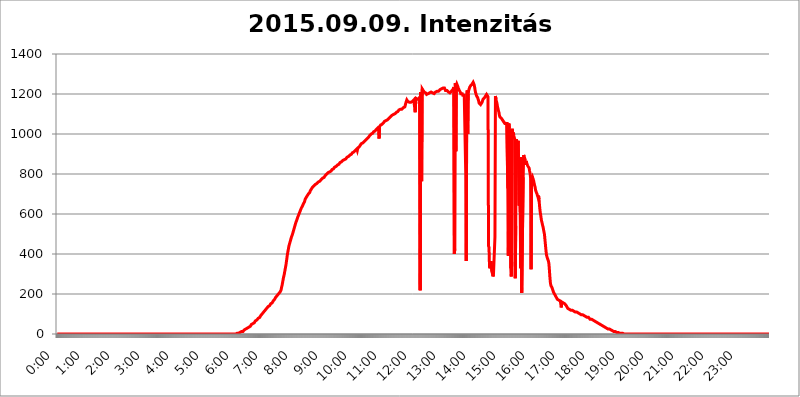
| Category | 2015.09.09. Intenzitás [W/m^2] |
|---|---|
| 0.0 | 0 |
| 0.0006944444444444445 | 0 |
| 0.001388888888888889 | 0 |
| 0.0020833333333333333 | 0 |
| 0.002777777777777778 | 0 |
| 0.003472222222222222 | 0 |
| 0.004166666666666667 | 0 |
| 0.004861111111111111 | 0 |
| 0.005555555555555556 | 0 |
| 0.0062499999999999995 | 0 |
| 0.006944444444444444 | 0 |
| 0.007638888888888889 | 0 |
| 0.008333333333333333 | 0 |
| 0.009027777777777779 | 0 |
| 0.009722222222222222 | 0 |
| 0.010416666666666666 | 0 |
| 0.011111111111111112 | 0 |
| 0.011805555555555555 | 0 |
| 0.012499999999999999 | 0 |
| 0.013194444444444444 | 0 |
| 0.013888888888888888 | 0 |
| 0.014583333333333332 | 0 |
| 0.015277777777777777 | 0 |
| 0.015972222222222224 | 0 |
| 0.016666666666666666 | 0 |
| 0.017361111111111112 | 0 |
| 0.018055555555555557 | 0 |
| 0.01875 | 0 |
| 0.019444444444444445 | 0 |
| 0.02013888888888889 | 0 |
| 0.020833333333333332 | 0 |
| 0.02152777777777778 | 0 |
| 0.022222222222222223 | 0 |
| 0.02291666666666667 | 0 |
| 0.02361111111111111 | 0 |
| 0.024305555555555556 | 0 |
| 0.024999999999999998 | 0 |
| 0.025694444444444447 | 0 |
| 0.02638888888888889 | 0 |
| 0.027083333333333334 | 0 |
| 0.027777777777777776 | 0 |
| 0.02847222222222222 | 0 |
| 0.029166666666666664 | 0 |
| 0.029861111111111113 | 0 |
| 0.030555555555555555 | 0 |
| 0.03125 | 0 |
| 0.03194444444444445 | 0 |
| 0.03263888888888889 | 0 |
| 0.03333333333333333 | 0 |
| 0.034027777777777775 | 0 |
| 0.034722222222222224 | 0 |
| 0.035416666666666666 | 0 |
| 0.036111111111111115 | 0 |
| 0.03680555555555556 | 0 |
| 0.0375 | 0 |
| 0.03819444444444444 | 0 |
| 0.03888888888888889 | 0 |
| 0.03958333333333333 | 0 |
| 0.04027777777777778 | 0 |
| 0.04097222222222222 | 0 |
| 0.041666666666666664 | 0 |
| 0.042361111111111106 | 0 |
| 0.04305555555555556 | 0 |
| 0.043750000000000004 | 0 |
| 0.044444444444444446 | 0 |
| 0.04513888888888889 | 0 |
| 0.04583333333333334 | 0 |
| 0.04652777777777778 | 0 |
| 0.04722222222222222 | 0 |
| 0.04791666666666666 | 0 |
| 0.04861111111111111 | 0 |
| 0.049305555555555554 | 0 |
| 0.049999999999999996 | 0 |
| 0.05069444444444445 | 0 |
| 0.051388888888888894 | 0 |
| 0.052083333333333336 | 0 |
| 0.05277777777777778 | 0 |
| 0.05347222222222222 | 0 |
| 0.05416666666666667 | 0 |
| 0.05486111111111111 | 0 |
| 0.05555555555555555 | 0 |
| 0.05625 | 0 |
| 0.05694444444444444 | 0 |
| 0.057638888888888885 | 0 |
| 0.05833333333333333 | 0 |
| 0.05902777777777778 | 0 |
| 0.059722222222222225 | 0 |
| 0.06041666666666667 | 0 |
| 0.061111111111111116 | 0 |
| 0.06180555555555556 | 0 |
| 0.0625 | 0 |
| 0.06319444444444444 | 0 |
| 0.06388888888888888 | 0 |
| 0.06458333333333334 | 0 |
| 0.06527777777777778 | 0 |
| 0.06597222222222222 | 0 |
| 0.06666666666666667 | 0 |
| 0.06736111111111111 | 0 |
| 0.06805555555555555 | 0 |
| 0.06874999999999999 | 0 |
| 0.06944444444444443 | 0 |
| 0.07013888888888889 | 0 |
| 0.07083333333333333 | 0 |
| 0.07152777777777779 | 0 |
| 0.07222222222222223 | 0 |
| 0.07291666666666667 | 0 |
| 0.07361111111111111 | 0 |
| 0.07430555555555556 | 0 |
| 0.075 | 0 |
| 0.07569444444444444 | 0 |
| 0.0763888888888889 | 0 |
| 0.07708333333333334 | 0 |
| 0.07777777777777778 | 0 |
| 0.07847222222222222 | 0 |
| 0.07916666666666666 | 0 |
| 0.0798611111111111 | 0 |
| 0.08055555555555556 | 0 |
| 0.08125 | 0 |
| 0.08194444444444444 | 0 |
| 0.08263888888888889 | 0 |
| 0.08333333333333333 | 0 |
| 0.08402777777777777 | 0 |
| 0.08472222222222221 | 0 |
| 0.08541666666666665 | 0 |
| 0.08611111111111112 | 0 |
| 0.08680555555555557 | 0 |
| 0.08750000000000001 | 0 |
| 0.08819444444444445 | 0 |
| 0.08888888888888889 | 0 |
| 0.08958333333333333 | 0 |
| 0.09027777777777778 | 0 |
| 0.09097222222222222 | 0 |
| 0.09166666666666667 | 0 |
| 0.09236111111111112 | 0 |
| 0.09305555555555556 | 0 |
| 0.09375 | 0 |
| 0.09444444444444444 | 0 |
| 0.09513888888888888 | 0 |
| 0.09583333333333333 | 0 |
| 0.09652777777777777 | 0 |
| 0.09722222222222222 | 0 |
| 0.09791666666666667 | 0 |
| 0.09861111111111111 | 0 |
| 0.09930555555555555 | 0 |
| 0.09999999999999999 | 0 |
| 0.10069444444444443 | 0 |
| 0.1013888888888889 | 0 |
| 0.10208333333333335 | 0 |
| 0.10277777777777779 | 0 |
| 0.10347222222222223 | 0 |
| 0.10416666666666667 | 0 |
| 0.10486111111111111 | 0 |
| 0.10555555555555556 | 0 |
| 0.10625 | 0 |
| 0.10694444444444444 | 0 |
| 0.1076388888888889 | 0 |
| 0.10833333333333334 | 0 |
| 0.10902777777777778 | 0 |
| 0.10972222222222222 | 0 |
| 0.1111111111111111 | 0 |
| 0.11180555555555556 | 0 |
| 0.11180555555555556 | 0 |
| 0.1125 | 0 |
| 0.11319444444444444 | 0 |
| 0.11388888888888889 | 0 |
| 0.11458333333333333 | 0 |
| 0.11527777777777777 | 0 |
| 0.11597222222222221 | 0 |
| 0.11666666666666665 | 0 |
| 0.1173611111111111 | 0 |
| 0.11805555555555557 | 0 |
| 0.11944444444444445 | 0 |
| 0.12013888888888889 | 0 |
| 0.12083333333333333 | 0 |
| 0.12152777777777778 | 0 |
| 0.12222222222222223 | 0 |
| 0.12291666666666667 | 0 |
| 0.12291666666666667 | 0 |
| 0.12361111111111112 | 0 |
| 0.12430555555555556 | 0 |
| 0.125 | 0 |
| 0.12569444444444444 | 0 |
| 0.12638888888888888 | 0 |
| 0.12708333333333333 | 0 |
| 0.16875 | 0 |
| 0.12847222222222224 | 0 |
| 0.12916666666666668 | 0 |
| 0.12986111111111112 | 0 |
| 0.13055555555555556 | 0 |
| 0.13125 | 0 |
| 0.13194444444444445 | 0 |
| 0.1326388888888889 | 0 |
| 0.13333333333333333 | 0 |
| 0.13402777777777777 | 0 |
| 0.13402777777777777 | 0 |
| 0.13472222222222222 | 0 |
| 0.13541666666666666 | 0 |
| 0.1361111111111111 | 0 |
| 0.13749999999999998 | 0 |
| 0.13819444444444443 | 0 |
| 0.1388888888888889 | 0 |
| 0.13958333333333334 | 0 |
| 0.14027777777777778 | 0 |
| 0.14097222222222222 | 0 |
| 0.14166666666666666 | 0 |
| 0.1423611111111111 | 0 |
| 0.14305555555555557 | 0 |
| 0.14375000000000002 | 0 |
| 0.14444444444444446 | 0 |
| 0.1451388888888889 | 0 |
| 0.1451388888888889 | 0 |
| 0.14652777777777778 | 0 |
| 0.14722222222222223 | 0 |
| 0.14791666666666667 | 0 |
| 0.1486111111111111 | 0 |
| 0.14930555555555555 | 0 |
| 0.15 | 0 |
| 0.15069444444444444 | 0 |
| 0.15138888888888888 | 0 |
| 0.15208333333333332 | 0 |
| 0.15277777777777776 | 0 |
| 0.15347222222222223 | 0 |
| 0.15416666666666667 | 0 |
| 0.15486111111111112 | 0 |
| 0.15555555555555556 | 0 |
| 0.15625 | 0 |
| 0.15694444444444444 | 0 |
| 0.15763888888888888 | 0 |
| 0.15833333333333333 | 0 |
| 0.15902777777777777 | 0 |
| 0.15972222222222224 | 0 |
| 0.16041666666666668 | 0 |
| 0.16111111111111112 | 0 |
| 0.16180555555555556 | 0 |
| 0.1625 | 0 |
| 0.16319444444444445 | 0 |
| 0.1638888888888889 | 0 |
| 0.16458333333333333 | 0 |
| 0.16527777777777777 | 0 |
| 0.16597222222222222 | 0 |
| 0.16666666666666666 | 0 |
| 0.1673611111111111 | 0 |
| 0.16805555555555554 | 0 |
| 0.16874999999999998 | 0 |
| 0.16944444444444443 | 0 |
| 0.17013888888888887 | 0 |
| 0.1708333333333333 | 0 |
| 0.17152777777777775 | 0 |
| 0.17222222222222225 | 0 |
| 0.1729166666666667 | 0 |
| 0.17361111111111113 | 0 |
| 0.17430555555555557 | 0 |
| 0.17500000000000002 | 0 |
| 0.17569444444444446 | 0 |
| 0.1763888888888889 | 0 |
| 0.17708333333333334 | 0 |
| 0.17777777777777778 | 0 |
| 0.17847222222222223 | 0 |
| 0.17916666666666667 | 0 |
| 0.1798611111111111 | 0 |
| 0.18055555555555555 | 0 |
| 0.18125 | 0 |
| 0.18194444444444444 | 0 |
| 0.1826388888888889 | 0 |
| 0.18333333333333335 | 0 |
| 0.1840277777777778 | 0 |
| 0.18472222222222223 | 0 |
| 0.18541666666666667 | 0 |
| 0.18611111111111112 | 0 |
| 0.18680555555555556 | 0 |
| 0.1875 | 0 |
| 0.18819444444444444 | 0 |
| 0.18888888888888888 | 0 |
| 0.18958333333333333 | 0 |
| 0.19027777777777777 | 0 |
| 0.1909722222222222 | 0 |
| 0.19166666666666665 | 0 |
| 0.19236111111111112 | 0 |
| 0.19305555555555554 | 0 |
| 0.19375 | 0 |
| 0.19444444444444445 | 0 |
| 0.1951388888888889 | 0 |
| 0.19583333333333333 | 0 |
| 0.19652777777777777 | 0 |
| 0.19722222222222222 | 0 |
| 0.19791666666666666 | 0 |
| 0.1986111111111111 | 0 |
| 0.19930555555555554 | 0 |
| 0.19999999999999998 | 0 |
| 0.20069444444444443 | 0 |
| 0.20138888888888887 | 0 |
| 0.2020833333333333 | 0 |
| 0.2027777777777778 | 0 |
| 0.2034722222222222 | 0 |
| 0.2041666666666667 | 0 |
| 0.20486111111111113 | 0 |
| 0.20555555555555557 | 0 |
| 0.20625000000000002 | 0 |
| 0.20694444444444446 | 0 |
| 0.2076388888888889 | 0 |
| 0.20833333333333334 | 0 |
| 0.20902777777777778 | 0 |
| 0.20972222222222223 | 0 |
| 0.21041666666666667 | 0 |
| 0.2111111111111111 | 0 |
| 0.21180555555555555 | 0 |
| 0.2125 | 0 |
| 0.21319444444444444 | 0 |
| 0.2138888888888889 | 0 |
| 0.21458333333333335 | 0 |
| 0.2152777777777778 | 0 |
| 0.21597222222222223 | 0 |
| 0.21666666666666667 | 0 |
| 0.21736111111111112 | 0 |
| 0.21805555555555556 | 0 |
| 0.21875 | 0 |
| 0.21944444444444444 | 0 |
| 0.22013888888888888 | 0 |
| 0.22083333333333333 | 0 |
| 0.22152777777777777 | 0 |
| 0.2222222222222222 | 0 |
| 0.22291666666666665 | 0 |
| 0.2236111111111111 | 0 |
| 0.22430555555555556 | 0 |
| 0.225 | 0 |
| 0.22569444444444445 | 0 |
| 0.2263888888888889 | 0 |
| 0.22708333333333333 | 0 |
| 0.22777777777777777 | 0 |
| 0.22847222222222222 | 0 |
| 0.22916666666666666 | 0 |
| 0.2298611111111111 | 0 |
| 0.23055555555555554 | 0 |
| 0.23124999999999998 | 0 |
| 0.23194444444444443 | 0 |
| 0.23263888888888887 | 0 |
| 0.2333333333333333 | 0 |
| 0.2340277777777778 | 0 |
| 0.2347222222222222 | 0 |
| 0.2354166666666667 | 0 |
| 0.23611111111111113 | 0 |
| 0.23680555555555557 | 0 |
| 0.23750000000000002 | 0 |
| 0.23819444444444446 | 0 |
| 0.2388888888888889 | 0 |
| 0.23958333333333334 | 0 |
| 0.24027777777777778 | 0 |
| 0.24097222222222223 | 0 |
| 0.24166666666666667 | 0 |
| 0.2423611111111111 | 0 |
| 0.24305555555555555 | 0 |
| 0.24375 | 0 |
| 0.24444444444444446 | 0 |
| 0.24513888888888888 | 0 |
| 0.24583333333333335 | 0 |
| 0.2465277777777778 | 0 |
| 0.24722222222222223 | 0 |
| 0.24791666666666667 | 0 |
| 0.24861111111111112 | 0 |
| 0.24930555555555556 | 0 |
| 0.25 | 0 |
| 0.25069444444444444 | 3.525 |
| 0.2513888888888889 | 3.525 |
| 0.2520833333333333 | 3.525 |
| 0.25277777777777777 | 3.525 |
| 0.2534722222222222 | 3.525 |
| 0.25416666666666665 | 3.525 |
| 0.2548611111111111 | 7.887 |
| 0.2555555555555556 | 7.887 |
| 0.25625000000000003 | 7.887 |
| 0.2569444444444445 | 7.887 |
| 0.2576388888888889 | 12.257 |
| 0.25833333333333336 | 12.257 |
| 0.2590277777777778 | 12.257 |
| 0.25972222222222224 | 12.257 |
| 0.2604166666666667 | 12.257 |
| 0.2611111111111111 | 16.636 |
| 0.26180555555555557 | 16.636 |
| 0.2625 | 21.024 |
| 0.26319444444444445 | 21.024 |
| 0.2638888888888889 | 21.024 |
| 0.26458333333333334 | 25.419 |
| 0.2652777777777778 | 25.419 |
| 0.2659722222222222 | 29.823 |
| 0.26666666666666666 | 29.823 |
| 0.2673611111111111 | 29.823 |
| 0.26805555555555555 | 34.234 |
| 0.26875 | 34.234 |
| 0.26944444444444443 | 38.653 |
| 0.2701388888888889 | 38.653 |
| 0.2708333333333333 | 38.653 |
| 0.27152777777777776 | 43.079 |
| 0.2722222222222222 | 47.511 |
| 0.27291666666666664 | 47.511 |
| 0.2736111111111111 | 47.511 |
| 0.2743055555555555 | 51.951 |
| 0.27499999999999997 | 51.951 |
| 0.27569444444444446 | 56.398 |
| 0.27638888888888885 | 56.398 |
| 0.27708333333333335 | 60.85 |
| 0.2777777777777778 | 65.31 |
| 0.27847222222222223 | 65.31 |
| 0.2791666666666667 | 69.775 |
| 0.2798611111111111 | 69.775 |
| 0.28055555555555556 | 69.775 |
| 0.28125 | 74.246 |
| 0.28194444444444444 | 78.722 |
| 0.2826388888888889 | 78.722 |
| 0.2833333333333333 | 83.205 |
| 0.28402777777777777 | 83.205 |
| 0.2847222222222222 | 87.692 |
| 0.28541666666666665 | 92.184 |
| 0.28611111111111115 | 92.184 |
| 0.28680555555555554 | 96.682 |
| 0.28750000000000003 | 101.184 |
| 0.2881944444444445 | 101.184 |
| 0.2888888888888889 | 105.69 |
| 0.28958333333333336 | 110.201 |
| 0.2902777777777778 | 110.201 |
| 0.29097222222222224 | 114.716 |
| 0.2916666666666667 | 119.235 |
| 0.2923611111111111 | 119.235 |
| 0.29305555555555557 | 123.758 |
| 0.29375 | 128.284 |
| 0.29444444444444445 | 132.814 |
| 0.2951388888888889 | 132.814 |
| 0.29583333333333334 | 137.347 |
| 0.2965277777777778 | 137.347 |
| 0.2972222222222222 | 141.884 |
| 0.29791666666666666 | 141.884 |
| 0.2986111111111111 | 146.423 |
| 0.29930555555555555 | 150.964 |
| 0.3 | 150.964 |
| 0.30069444444444443 | 155.509 |
| 0.3013888888888889 | 155.509 |
| 0.3020833333333333 | 160.056 |
| 0.30277777777777776 | 164.605 |
| 0.3034722222222222 | 169.156 |
| 0.30416666666666664 | 169.156 |
| 0.3048611111111111 | 173.709 |
| 0.3055555555555555 | 178.264 |
| 0.30624999999999997 | 182.82 |
| 0.3069444444444444 | 182.82 |
| 0.3076388888888889 | 187.378 |
| 0.30833333333333335 | 191.937 |
| 0.3090277777777778 | 191.937 |
| 0.30972222222222223 | 196.497 |
| 0.3104166666666667 | 201.058 |
| 0.3111111111111111 | 201.058 |
| 0.31180555555555556 | 205.62 |
| 0.3125 | 210.182 |
| 0.31319444444444444 | 214.746 |
| 0.3138888888888889 | 219.309 |
| 0.3145833333333333 | 233 |
| 0.31527777777777777 | 242.127 |
| 0.3159722222222222 | 255.813 |
| 0.31666666666666665 | 269.49 |
| 0.31736111111111115 | 283.156 |
| 0.31805555555555554 | 292.259 |
| 0.31875000000000003 | 305.898 |
| 0.3194444444444445 | 319.517 |
| 0.3201388888888889 | 333.113 |
| 0.32083333333333336 | 346.682 |
| 0.3215277777777778 | 364.728 |
| 0.32222222222222224 | 382.715 |
| 0.3229166666666667 | 400.638 |
| 0.3236111111111111 | 414.035 |
| 0.32430555555555557 | 427.39 |
| 0.325 | 440.702 |
| 0.32569444444444445 | 449.551 |
| 0.3263888888888889 | 458.38 |
| 0.32708333333333334 | 467.187 |
| 0.3277777777777778 | 475.972 |
| 0.3284722222222222 | 484.735 |
| 0.32916666666666666 | 489.108 |
| 0.3298611111111111 | 497.836 |
| 0.33055555555555555 | 506.542 |
| 0.33125 | 515.223 |
| 0.33194444444444443 | 523.88 |
| 0.3326388888888889 | 532.513 |
| 0.3333333333333333 | 541.121 |
| 0.3340277777777778 | 549.704 |
| 0.3347222222222222 | 558.261 |
| 0.3354166666666667 | 562.53 |
| 0.3361111111111111 | 571.049 |
| 0.3368055555555556 | 579.542 |
| 0.33749999999999997 | 583.779 |
| 0.33819444444444446 | 592.233 |
| 0.33888888888888885 | 596.45 |
| 0.33958333333333335 | 604.864 |
| 0.34027777777777773 | 609.062 |
| 0.34097222222222223 | 617.436 |
| 0.3416666666666666 | 621.613 |
| 0.3423611111111111 | 629.948 |
| 0.3430555555555555 | 634.105 |
| 0.34375 | 638.256 |
| 0.3444444444444445 | 642.4 |
| 0.3451388888888889 | 650.667 |
| 0.3458333333333334 | 654.791 |
| 0.34652777777777777 | 658.909 |
| 0.34722222222222227 | 667.123 |
| 0.34791666666666665 | 675.311 |
| 0.34861111111111115 | 679.395 |
| 0.34930555555555554 | 683.473 |
| 0.35000000000000003 | 687.544 |
| 0.3506944444444444 | 691.608 |
| 0.3513888888888889 | 691.608 |
| 0.3520833333333333 | 699.717 |
| 0.3527777777777778 | 703.762 |
| 0.3534722222222222 | 703.762 |
| 0.3541666666666667 | 707.8 |
| 0.3548611111111111 | 715.858 |
| 0.35555555555555557 | 715.858 |
| 0.35625 | 723.889 |
| 0.35694444444444445 | 727.896 |
| 0.3576388888888889 | 731.896 |
| 0.35833333333333334 | 731.896 |
| 0.3590277777777778 | 735.89 |
| 0.3597222222222222 | 739.877 |
| 0.36041666666666666 | 739.877 |
| 0.3611111111111111 | 743.859 |
| 0.36180555555555555 | 747.834 |
| 0.3625 | 747.834 |
| 0.36319444444444443 | 751.803 |
| 0.3638888888888889 | 751.803 |
| 0.3645833333333333 | 751.803 |
| 0.3652777777777778 | 755.766 |
| 0.3659722222222222 | 759.723 |
| 0.3666666666666667 | 759.723 |
| 0.3673611111111111 | 763.674 |
| 0.3680555555555556 | 763.674 |
| 0.36874999999999997 | 767.62 |
| 0.36944444444444446 | 767.62 |
| 0.37013888888888885 | 771.559 |
| 0.37083333333333335 | 775.492 |
| 0.37152777777777773 | 775.492 |
| 0.37222222222222223 | 779.42 |
| 0.3729166666666666 | 783.342 |
| 0.3736111111111111 | 783.342 |
| 0.3743055555555555 | 783.342 |
| 0.375 | 787.258 |
| 0.3756944444444445 | 791.169 |
| 0.3763888888888889 | 791.169 |
| 0.3770833333333334 | 795.074 |
| 0.37777777777777777 | 798.974 |
| 0.37847222222222227 | 798.974 |
| 0.37916666666666665 | 798.974 |
| 0.37986111111111115 | 806.757 |
| 0.38055555555555554 | 806.757 |
| 0.38125000000000003 | 806.757 |
| 0.3819444444444444 | 810.641 |
| 0.3826388888888889 | 814.519 |
| 0.3833333333333333 | 814.519 |
| 0.3840277777777778 | 814.519 |
| 0.3847222222222222 | 818.392 |
| 0.3854166666666667 | 822.26 |
| 0.3861111111111111 | 822.26 |
| 0.38680555555555557 | 826.123 |
| 0.3875 | 826.123 |
| 0.38819444444444445 | 829.981 |
| 0.3888888888888889 | 833.834 |
| 0.38958333333333334 | 833.834 |
| 0.3902777777777778 | 837.682 |
| 0.3909722222222222 | 837.682 |
| 0.39166666666666666 | 841.526 |
| 0.3923611111111111 | 841.526 |
| 0.39305555555555555 | 845.365 |
| 0.39375 | 845.365 |
| 0.39444444444444443 | 849.199 |
| 0.3951388888888889 | 849.199 |
| 0.3958333333333333 | 853.029 |
| 0.3965277777777778 | 856.855 |
| 0.3972222222222222 | 856.855 |
| 0.3979166666666667 | 860.676 |
| 0.3986111111111111 | 860.676 |
| 0.3993055555555556 | 860.676 |
| 0.39999999999999997 | 864.493 |
| 0.40069444444444446 | 868.305 |
| 0.40138888888888885 | 868.305 |
| 0.40208333333333335 | 868.305 |
| 0.40277777777777773 | 872.114 |
| 0.40347222222222223 | 875.918 |
| 0.4041666666666666 | 875.918 |
| 0.4048611111111111 | 875.918 |
| 0.4055555555555555 | 879.719 |
| 0.40625 | 883.516 |
| 0.4069444444444445 | 883.516 |
| 0.4076388888888889 | 883.516 |
| 0.4083333333333334 | 887.309 |
| 0.40902777777777777 | 887.309 |
| 0.40972222222222227 | 891.099 |
| 0.41041666666666665 | 894.885 |
| 0.41111111111111115 | 894.885 |
| 0.41180555555555554 | 898.668 |
| 0.41250000000000003 | 898.668 |
| 0.4131944444444444 | 902.447 |
| 0.4138888888888889 | 906.223 |
| 0.4145833333333333 | 906.223 |
| 0.4152777777777778 | 909.996 |
| 0.4159722222222222 | 909.996 |
| 0.4166666666666667 | 913.766 |
| 0.4173611111111111 | 913.766 |
| 0.41805555555555557 | 917.534 |
| 0.41875 | 921.298 |
| 0.41944444444444445 | 921.298 |
| 0.4201388888888889 | 925.06 |
| 0.42083333333333334 | 917.534 |
| 0.4215277777777778 | 928.819 |
| 0.4222222222222222 | 928.819 |
| 0.42291666666666666 | 932.576 |
| 0.4236111111111111 | 936.33 |
| 0.42430555555555555 | 940.082 |
| 0.425 | 943.832 |
| 0.42569444444444443 | 947.58 |
| 0.4263888888888889 | 951.327 |
| 0.4270833333333333 | 951.327 |
| 0.4277777777777778 | 947.58 |
| 0.4284722222222222 | 955.071 |
| 0.4291666666666667 | 958.814 |
| 0.4298611111111111 | 958.814 |
| 0.4305555555555556 | 962.555 |
| 0.43124999999999997 | 962.555 |
| 0.43194444444444446 | 966.295 |
| 0.43263888888888885 | 970.034 |
| 0.43333333333333335 | 973.772 |
| 0.43402777777777773 | 973.772 |
| 0.43472222222222223 | 977.508 |
| 0.4354166666666666 | 977.508 |
| 0.4361111111111111 | 981.244 |
| 0.4368055555555555 | 984.98 |
| 0.4375 | 988.714 |
| 0.4381944444444445 | 992.448 |
| 0.4388888888888889 | 992.448 |
| 0.4395833333333334 | 996.182 |
| 0.44027777777777777 | 999.916 |
| 0.44097222222222227 | 999.916 |
| 0.44166666666666665 | 999.916 |
| 0.44236111111111115 | 1003.65 |
| 0.44305555555555554 | 1007.383 |
| 0.44375000000000003 | 1011.118 |
| 0.4444444444444444 | 1014.852 |
| 0.4451388888888889 | 1014.852 |
| 0.4458333333333333 | 1014.852 |
| 0.4465277777777778 | 1014.852 |
| 0.4472222222222222 | 1022.323 |
| 0.4479166666666667 | 1022.323 |
| 0.4486111111111111 | 1026.06 |
| 0.44930555555555557 | 1029.798 |
| 0.45 | 1029.798 |
| 0.45069444444444445 | 1018.587 |
| 0.4513888888888889 | 977.508 |
| 0.45208333333333334 | 1037.277 |
| 0.4527777777777778 | 1037.277 |
| 0.4534722222222222 | 1044.762 |
| 0.45416666666666666 | 1044.762 |
| 0.4548611111111111 | 1044.762 |
| 0.45555555555555555 | 1048.508 |
| 0.45625 | 1048.508 |
| 0.45694444444444443 | 1052.255 |
| 0.4576388888888889 | 1056.004 |
| 0.4583333333333333 | 1059.756 |
| 0.4590277777777778 | 1063.51 |
| 0.4597222222222222 | 1063.51 |
| 0.4604166666666667 | 1067.267 |
| 0.4611111111111111 | 1067.267 |
| 0.4618055555555556 | 1067.267 |
| 0.46249999999999997 | 1071.027 |
| 0.46319444444444446 | 1071.027 |
| 0.46388888888888885 | 1074.789 |
| 0.46458333333333335 | 1074.789 |
| 0.46527777777777773 | 1078.555 |
| 0.46597222222222223 | 1078.555 |
| 0.4666666666666666 | 1082.324 |
| 0.4673611111111111 | 1086.097 |
| 0.4680555555555555 | 1089.873 |
| 0.46875 | 1089.873 |
| 0.4694444444444445 | 1093.653 |
| 0.4701388888888889 | 1093.653 |
| 0.4708333333333334 | 1097.437 |
| 0.47152777777777777 | 1097.437 |
| 0.47222222222222227 | 1101.226 |
| 0.47291666666666665 | 1101.226 |
| 0.47361111111111115 | 1101.226 |
| 0.47430555555555554 | 1101.226 |
| 0.47500000000000003 | 1105.019 |
| 0.4756944444444444 | 1108.816 |
| 0.4763888888888889 | 1112.618 |
| 0.4770833333333333 | 1112.618 |
| 0.4777777777777778 | 1112.618 |
| 0.4784722222222222 | 1116.426 |
| 0.4791666666666667 | 1120.238 |
| 0.4798611111111111 | 1120.238 |
| 0.48055555555555557 | 1120.238 |
| 0.48125 | 1124.056 |
| 0.48194444444444445 | 1124.056 |
| 0.4826388888888889 | 1124.056 |
| 0.48333333333333334 | 1124.056 |
| 0.4840277777777778 | 1124.056 |
| 0.4847222222222222 | 1127.879 |
| 0.48541666666666666 | 1131.708 |
| 0.4861111111111111 | 1131.708 |
| 0.48680555555555555 | 1135.543 |
| 0.4875 | 1135.543 |
| 0.48819444444444443 | 1139.384 |
| 0.4888888888888889 | 1154.814 |
| 0.4895833333333333 | 1150.946 |
| 0.4902777777777778 | 1170.358 |
| 0.4909722222222222 | 1166.46 |
| 0.4916666666666667 | 1162.571 |
| 0.4923611111111111 | 1162.571 |
| 0.4930555555555556 | 1158.689 |
| 0.49374999999999997 | 1158.689 |
| 0.49444444444444446 | 1158.689 |
| 0.49513888888888885 | 1154.814 |
| 0.49583333333333335 | 1158.689 |
| 0.49652777777777773 | 1162.571 |
| 0.49722222222222223 | 1158.689 |
| 0.4979166666666666 | 1162.571 |
| 0.4986111111111111 | 1162.571 |
| 0.4993055555555555 | 1166.46 |
| 0.5 | 1170.358 |
| 0.5006944444444444 | 1170.358 |
| 0.5013888888888889 | 1170.358 |
| 0.5020833333333333 | 1108.816 |
| 0.5027777777777778 | 1162.571 |
| 0.5034722222222222 | 1178.177 |
| 0.5041666666666667 | 1178.177 |
| 0.5048611111111111 | 1178.177 |
| 0.5055555555555555 | 1174.263 |
| 0.50625 | 1174.263 |
| 0.5069444444444444 | 1178.177 |
| 0.5076388888888889 | 1178.177 |
| 0.5083333333333333 | 1186.03 |
| 0.5090277777777777 | 219.309 |
| 0.5097222222222222 | 1209.807 |
| 0.5104166666666666 | 775.492 |
| 0.5111111111111112 | 763.674 |
| 0.5118055555555555 | 1225.859 |
| 0.5125000000000001 | 1221.83 |
| 0.5131944444444444 | 1217.812 |
| 0.513888888888889 | 1213.804 |
| 0.5145833333333333 | 1209.807 |
| 0.5152777777777778 | 1205.82 |
| 0.5159722222222222 | 1205.82 |
| 0.5166666666666667 | 1205.82 |
| 0.517361111111111 | 1201.843 |
| 0.5180555555555556 | 1197.876 |
| 0.5187499999999999 | 1197.876 |
| 0.5194444444444445 | 1201.843 |
| 0.5201388888888888 | 1201.843 |
| 0.5208333333333334 | 1201.843 |
| 0.5215277777777778 | 1201.843 |
| 0.5222222222222223 | 1205.82 |
| 0.5229166666666667 | 1209.807 |
| 0.5236111111111111 | 1209.807 |
| 0.5243055555555556 | 1209.807 |
| 0.525 | 1209.807 |
| 0.5256944444444445 | 1209.807 |
| 0.5263888888888889 | 1205.82 |
| 0.5270833333333333 | 1201.843 |
| 0.5277777777777778 | 1201.843 |
| 0.5284722222222222 | 1201.843 |
| 0.5291666666666667 | 1201.843 |
| 0.5298611111111111 | 1205.82 |
| 0.5305555555555556 | 1209.807 |
| 0.53125 | 1209.807 |
| 0.5319444444444444 | 1209.807 |
| 0.5326388888888889 | 1213.804 |
| 0.5333333333333333 | 1213.804 |
| 0.5340277777777778 | 1213.804 |
| 0.5347222222222222 | 1213.804 |
| 0.5354166666666667 | 1213.804 |
| 0.5361111111111111 | 1217.812 |
| 0.5368055555555555 | 1221.83 |
| 0.5375 | 1221.83 |
| 0.5381944444444444 | 1221.83 |
| 0.5388888888888889 | 1225.859 |
| 0.5395833333333333 | 1225.859 |
| 0.5402777777777777 | 1225.859 |
| 0.5409722222222222 | 1229.899 |
| 0.5416666666666666 | 1233.951 |
| 0.5423611111111112 | 1233.951 |
| 0.5430555555555555 | 1229.899 |
| 0.5437500000000001 | 1225.859 |
| 0.5444444444444444 | 1217.812 |
| 0.545138888888889 | 1217.812 |
| 0.5458333333333333 | 1217.812 |
| 0.5465277777777778 | 1217.812 |
| 0.5472222222222222 | 1213.804 |
| 0.5479166666666667 | 1213.804 |
| 0.548611111111111 | 1209.807 |
| 0.5493055555555556 | 1209.807 |
| 0.5499999999999999 | 1209.807 |
| 0.5506944444444445 | 1205.82 |
| 0.5513888888888888 | 1209.807 |
| 0.5520833333333334 | 1209.807 |
| 0.5527777777777778 | 1213.804 |
| 0.5534722222222223 | 1209.807 |
| 0.5541666666666667 | 1213.804 |
| 0.5548611111111111 | 1221.83 |
| 0.5555555555555556 | 1225.859 |
| 0.55625 | 1233.951 |
| 0.5569444444444445 | 400.638 |
| 0.5576388888888889 | 427.39 |
| 0.5583333333333333 | 1254.387 |
| 0.5590277777777778 | 913.766 |
| 0.5597222222222222 | 1242.089 |
| 0.5604166666666667 | 1250.275 |
| 0.5611111111111111 | 1246.176 |
| 0.5618055555555556 | 1238.014 |
| 0.5625 | 1229.899 |
| 0.5631944444444444 | 1225.859 |
| 0.5638888888888889 | 1217.812 |
| 0.5645833333333333 | 1213.804 |
| 0.5652777777777778 | 1209.807 |
| 0.5659722222222222 | 1201.843 |
| 0.5666666666666667 | 1201.843 |
| 0.5673611111111111 | 1201.843 |
| 0.5680555555555555 | 1201.843 |
| 0.56875 | 1193.918 |
| 0.5694444444444444 | 1193.918 |
| 0.5701388888888889 | 1189.969 |
| 0.5708333333333333 | 1193.918 |
| 0.5715277777777777 | 1193.918 |
| 0.5722222222222222 | 1197.876 |
| 0.5729166666666666 | 802.868 |
| 0.5736111111111112 | 364.728 |
| 0.5743055555555555 | 1170.358 |
| 0.5750000000000001 | 1217.812 |
| 0.5756944444444444 | 999.916 |
| 0.576388888888889 | 1201.843 |
| 0.5770833333333333 | 1217.812 |
| 0.5777777777777778 | 1225.859 |
| 0.5784722222222222 | 1233.951 |
| 0.5791666666666667 | 1238.014 |
| 0.579861111111111 | 1242.089 |
| 0.5805555555555556 | 1242.089 |
| 0.5812499999999999 | 1242.089 |
| 0.5819444444444445 | 1250.275 |
| 0.5826388888888888 | 1254.387 |
| 0.5833333333333334 | 1258.511 |
| 0.5840277777777778 | 1254.387 |
| 0.5847222222222223 | 1246.176 |
| 0.5854166666666667 | 1233.951 |
| 0.5861111111111111 | 1217.812 |
| 0.5868055555555556 | 1205.82 |
| 0.5875 | 1197.876 |
| 0.5881944444444445 | 1189.969 |
| 0.5888888888888889 | 1186.03 |
| 0.5895833333333333 | 1182.099 |
| 0.5902777777777778 | 1174.263 |
| 0.5909722222222222 | 1166.46 |
| 0.5916666666666667 | 1154.814 |
| 0.5923611111111111 | 1154.814 |
| 0.5930555555555556 | 1150.946 |
| 0.59375 | 1147.086 |
| 0.5944444444444444 | 1143.232 |
| 0.5951388888888889 | 1143.232 |
| 0.5958333333333333 | 1158.689 |
| 0.5965277777777778 | 1166.46 |
| 0.5972222222222222 | 1174.263 |
| 0.5979166666666667 | 1178.177 |
| 0.5986111111111111 | 1178.177 |
| 0.5993055555555555 | 1182.099 |
| 0.6 | 1186.03 |
| 0.6006944444444444 | 1189.969 |
| 0.6013888888888889 | 1193.918 |
| 0.6020833333333333 | 1197.876 |
| 0.6027777777777777 | 1201.843 |
| 0.6034722222222222 | 1197.876 |
| 0.6041666666666666 | 1186.03 |
| 0.6048611111111112 | 440.702 |
| 0.6055555555555555 | 431.833 |
| 0.6062500000000001 | 337.639 |
| 0.6069444444444444 | 328.584 |
| 0.607638888888889 | 346.682 |
| 0.6083333333333333 | 364.728 |
| 0.6090277777777778 | 360.221 |
| 0.6097222222222222 | 310.44 |
| 0.6104166666666667 | 301.354 |
| 0.611111111111111 | 287.709 |
| 0.6118055555555556 | 296.808 |
| 0.6124999999999999 | 292.259 |
| 0.6131944444444445 | 296.808 |
| 0.6138888888888888 | 484.735 |
| 0.6145833333333334 | 1189.969 |
| 0.6152777777777778 | 1174.263 |
| 0.6159722222222223 | 1162.571 |
| 0.6166666666666667 | 1154.814 |
| 0.6173611111111111 | 1139.384 |
| 0.6180555555555556 | 1127.879 |
| 0.61875 | 1116.426 |
| 0.6194444444444445 | 1108.816 |
| 0.6201388888888889 | 1093.653 |
| 0.6208333333333333 | 1086.097 |
| 0.6215277777777778 | 1086.097 |
| 0.6222222222222222 | 1082.324 |
| 0.6229166666666667 | 1078.555 |
| 0.6236111111111111 | 1078.555 |
| 0.6243055555555556 | 1074.789 |
| 0.625 | 1067.267 |
| 0.6256944444444444 | 1063.51 |
| 0.6263888888888889 | 1059.756 |
| 0.6270833333333333 | 1056.004 |
| 0.6277777777777778 | 1052.255 |
| 0.6284722222222222 | 1052.255 |
| 0.6291666666666667 | 1052.255 |
| 0.6298611111111111 | 1052.255 |
| 0.6305555555555555 | 1059.756 |
| 0.63125 | 1059.756 |
| 0.6319444444444444 | 727.896 |
| 0.6326388888888889 | 391.685 |
| 0.6333333333333333 | 1052.255 |
| 0.6340277777777777 | 1029.798 |
| 0.6347222222222222 | 856.855 |
| 0.6354166666666666 | 1022.323 |
| 0.6361111111111112 | 328.584 |
| 0.6368055555555555 | 287.709 |
| 0.6375000000000001 | 360.221 |
| 0.6381944444444444 | 1026.06 |
| 0.638888888888889 | 992.448 |
| 0.6395833333333333 | 1007.383 |
| 0.6402777777777778 | 992.448 |
| 0.6409722222222222 | 988.714 |
| 0.6416666666666667 | 973.772 |
| 0.642361111111111 | 278.603 |
| 0.6430555555555556 | 541.121 |
| 0.6437499999999999 | 973.772 |
| 0.6444444444444445 | 962.555 |
| 0.6451388888888888 | 958.814 |
| 0.6458333333333334 | 955.071 |
| 0.6465277777777778 | 966.295 |
| 0.6472222222222223 | 962.555 |
| 0.6479166666666667 | 642.4 |
| 0.6486111111111111 | 875.918 |
| 0.6493055555555556 | 609.062 |
| 0.65 | 328.584 |
| 0.6506944444444445 | 883.516 |
| 0.6513888888888889 | 205.62 |
| 0.6520833333333333 | 201.058 |
| 0.6527777777777778 | 210.182 |
| 0.6534722222222222 | 783.342 |
| 0.6541666666666667 | 894.885 |
| 0.6548611111111111 | 887.309 |
| 0.6555555555555556 | 883.516 |
| 0.65625 | 872.114 |
| 0.6569444444444444 | 845.365 |
| 0.6576388888888889 | 864.493 |
| 0.6583333333333333 | 856.855 |
| 0.6590277777777778 | 849.199 |
| 0.6597222222222222 | 841.526 |
| 0.6604166666666667 | 841.526 |
| 0.6611111111111111 | 837.682 |
| 0.6618055555555555 | 829.981 |
| 0.6625 | 814.519 |
| 0.6631944444444444 | 802.868 |
| 0.6638888888888889 | 779.42 |
| 0.6645833333333333 | 324.052 |
| 0.6652777777777777 | 791.169 |
| 0.6659722222222222 | 775.492 |
| 0.6666666666666666 | 783.342 |
| 0.6673611111111111 | 783.342 |
| 0.6680555555555556 | 767.62 |
| 0.6687500000000001 | 755.766 |
| 0.6694444444444444 | 743.859 |
| 0.6701388888888888 | 735.89 |
| 0.6708333333333334 | 719.877 |
| 0.6715277777777778 | 711.832 |
| 0.6722222222222222 | 707.8 |
| 0.6729166666666666 | 699.717 |
| 0.6736111111111112 | 695.666 |
| 0.6743055555555556 | 683.473 |
| 0.6749999999999999 | 691.608 |
| 0.6756944444444444 | 675.311 |
| 0.6763888888888889 | 642.4 |
| 0.6770833333333334 | 617.436 |
| 0.6777777777777777 | 600.661 |
| 0.6784722222222223 | 583.779 |
| 0.6791666666666667 | 566.793 |
| 0.6798611111111111 | 558.261 |
| 0.6805555555555555 | 545.416 |
| 0.68125 | 536.82 |
| 0.6819444444444445 | 523.88 |
| 0.6826388888888889 | 510.885 |
| 0.6833333333333332 | 497.836 |
| 0.6840277777777778 | 471.582 |
| 0.6847222222222222 | 445.129 |
| 0.6854166666666667 | 418.492 |
| 0.686111111111111 | 396.164 |
| 0.6868055555555556 | 387.202 |
| 0.6875 | 378.224 |
| 0.6881944444444444 | 373.729 |
| 0.688888888888889 | 364.728 |
| 0.6895833333333333 | 351.198 |
| 0.6902777777777778 | 319.517 |
| 0.6909722222222222 | 283.156 |
| 0.6916666666666668 | 255.813 |
| 0.6923611111111111 | 242.127 |
| 0.6930555555555555 | 237.564 |
| 0.69375 | 233 |
| 0.6944444444444445 | 228.436 |
| 0.6951388888888889 | 219.309 |
| 0.6958333333333333 | 210.182 |
| 0.6965277777777777 | 205.62 |
| 0.6972222222222223 | 201.058 |
| 0.6979166666666666 | 201.058 |
| 0.6986111111111111 | 191.937 |
| 0.6993055555555556 | 191.937 |
| 0.7000000000000001 | 182.82 |
| 0.7006944444444444 | 178.264 |
| 0.7013888888888888 | 173.709 |
| 0.7020833333333334 | 173.709 |
| 0.7027777777777778 | 169.156 |
| 0.7034722222222222 | 169.156 |
| 0.7041666666666666 | 169.156 |
| 0.7048611111111112 | 164.605 |
| 0.7055555555555556 | 164.605 |
| 0.7062499999999999 | 164.605 |
| 0.7069444444444444 | 132.814 |
| 0.7076388888888889 | 160.056 |
| 0.7083333333333334 | 155.509 |
| 0.7090277777777777 | 155.509 |
| 0.7097222222222223 | 155.509 |
| 0.7104166666666667 | 150.964 |
| 0.7111111111111111 | 150.964 |
| 0.7118055555555555 | 150.964 |
| 0.7125 | 146.423 |
| 0.7131944444444445 | 146.423 |
| 0.7138888888888889 | 141.884 |
| 0.7145833333333332 | 137.347 |
| 0.7152777777777778 | 137.347 |
| 0.7159722222222222 | 128.284 |
| 0.7166666666666667 | 128.284 |
| 0.717361111111111 | 128.284 |
| 0.7180555555555556 | 123.758 |
| 0.71875 | 123.758 |
| 0.7194444444444444 | 123.758 |
| 0.720138888888889 | 119.235 |
| 0.7208333333333333 | 119.235 |
| 0.7215277777777778 | 119.235 |
| 0.7222222222222222 | 119.235 |
| 0.7229166666666668 | 114.716 |
| 0.7236111111111111 | 114.716 |
| 0.7243055555555555 | 114.716 |
| 0.725 | 114.716 |
| 0.7256944444444445 | 110.201 |
| 0.7263888888888889 | 110.201 |
| 0.7270833333333333 | 110.201 |
| 0.7277777777777777 | 110.201 |
| 0.7284722222222223 | 110.201 |
| 0.7291666666666666 | 105.69 |
| 0.7298611111111111 | 105.69 |
| 0.7305555555555556 | 105.69 |
| 0.7312500000000001 | 101.184 |
| 0.7319444444444444 | 101.184 |
| 0.7326388888888888 | 101.184 |
| 0.7333333333333334 | 101.184 |
| 0.7340277777777778 | 101.184 |
| 0.7347222222222222 | 96.682 |
| 0.7354166666666666 | 96.682 |
| 0.7361111111111112 | 96.682 |
| 0.7368055555555556 | 96.682 |
| 0.7374999999999999 | 92.184 |
| 0.7381944444444444 | 92.184 |
| 0.7388888888888889 | 92.184 |
| 0.7395833333333334 | 92.184 |
| 0.7402777777777777 | 92.184 |
| 0.7409722222222223 | 87.692 |
| 0.7416666666666667 | 87.692 |
| 0.7423611111111111 | 87.692 |
| 0.7430555555555555 | 83.205 |
| 0.74375 | 83.205 |
| 0.7444444444444445 | 83.205 |
| 0.7451388888888889 | 83.205 |
| 0.7458333333333332 | 78.722 |
| 0.7465277777777778 | 78.722 |
| 0.7472222222222222 | 74.246 |
| 0.7479166666666667 | 74.246 |
| 0.748611111111111 | 74.246 |
| 0.7493055555555556 | 74.246 |
| 0.75 | 69.775 |
| 0.7506944444444444 | 69.775 |
| 0.751388888888889 | 69.775 |
| 0.7520833333333333 | 65.31 |
| 0.7527777777777778 | 65.31 |
| 0.7534722222222222 | 65.31 |
| 0.7541666666666668 | 60.85 |
| 0.7548611111111111 | 60.85 |
| 0.7555555555555555 | 60.85 |
| 0.75625 | 56.398 |
| 0.7569444444444445 | 56.398 |
| 0.7576388888888889 | 56.398 |
| 0.7583333333333333 | 56.398 |
| 0.7590277777777777 | 51.951 |
| 0.7597222222222223 | 51.951 |
| 0.7604166666666666 | 51.951 |
| 0.7611111111111111 | 47.511 |
| 0.7618055555555556 | 47.511 |
| 0.7625000000000001 | 47.511 |
| 0.7631944444444444 | 47.511 |
| 0.7638888888888888 | 43.079 |
| 0.7645833333333334 | 43.079 |
| 0.7652777777777778 | 43.079 |
| 0.7659722222222222 | 38.653 |
| 0.7666666666666666 | 38.653 |
| 0.7673611111111112 | 34.234 |
| 0.7680555555555556 | 34.234 |
| 0.7687499999999999 | 34.234 |
| 0.7694444444444444 | 34.234 |
| 0.7701388888888889 | 29.823 |
| 0.7708333333333334 | 29.823 |
| 0.7715277777777777 | 29.823 |
| 0.7722222222222223 | 25.419 |
| 0.7729166666666667 | 25.419 |
| 0.7736111111111111 | 25.419 |
| 0.7743055555555555 | 25.419 |
| 0.775 | 21.024 |
| 0.7756944444444445 | 21.024 |
| 0.7763888888888889 | 21.024 |
| 0.7770833333333332 | 21.024 |
| 0.7777777777777778 | 16.636 |
| 0.7784722222222222 | 16.636 |
| 0.7791666666666667 | 16.636 |
| 0.779861111111111 | 16.636 |
| 0.7805555555555556 | 12.257 |
| 0.78125 | 12.257 |
| 0.7819444444444444 | 12.257 |
| 0.782638888888889 | 12.257 |
| 0.7833333333333333 | 7.887 |
| 0.7840277777777778 | 7.887 |
| 0.7847222222222222 | 7.887 |
| 0.7854166666666668 | 7.887 |
| 0.7861111111111111 | 7.887 |
| 0.7868055555555555 | 7.887 |
| 0.7875 | 7.887 |
| 0.7881944444444445 | 3.525 |
| 0.7888888888888889 | 3.525 |
| 0.7895833333333333 | 3.525 |
| 0.7902777777777777 | 3.525 |
| 0.7909722222222223 | 3.525 |
| 0.7916666666666666 | 3.525 |
| 0.7923611111111111 | 3.525 |
| 0.7930555555555556 | 3.525 |
| 0.7937500000000001 | 0 |
| 0.7944444444444444 | 0 |
| 0.7951388888888888 | 0 |
| 0.7958333333333334 | 0 |
| 0.7965277777777778 | 0 |
| 0.7972222222222222 | 0 |
| 0.7979166666666666 | 0 |
| 0.7986111111111112 | 0 |
| 0.7993055555555556 | 0 |
| 0.7999999999999999 | 0 |
| 0.8006944444444444 | 0 |
| 0.8013888888888889 | 0 |
| 0.8020833333333334 | 0 |
| 0.8027777777777777 | 0 |
| 0.8034722222222223 | 0 |
| 0.8041666666666667 | 0 |
| 0.8048611111111111 | 0 |
| 0.8055555555555555 | 0 |
| 0.80625 | 0 |
| 0.8069444444444445 | 0 |
| 0.8076388888888889 | 0 |
| 0.8083333333333332 | 0 |
| 0.8090277777777778 | 0 |
| 0.8097222222222222 | 0 |
| 0.8104166666666667 | 0 |
| 0.811111111111111 | 0 |
| 0.8118055555555556 | 0 |
| 0.8125 | 0 |
| 0.8131944444444444 | 0 |
| 0.813888888888889 | 0 |
| 0.8145833333333333 | 0 |
| 0.8152777777777778 | 0 |
| 0.8159722222222222 | 0 |
| 0.8166666666666668 | 0 |
| 0.8173611111111111 | 0 |
| 0.8180555555555555 | 0 |
| 0.81875 | 0 |
| 0.8194444444444445 | 0 |
| 0.8201388888888889 | 0 |
| 0.8208333333333333 | 0 |
| 0.8215277777777777 | 0 |
| 0.8222222222222223 | 0 |
| 0.8229166666666666 | 0 |
| 0.8236111111111111 | 0 |
| 0.8243055555555556 | 0 |
| 0.8250000000000001 | 0 |
| 0.8256944444444444 | 0 |
| 0.8263888888888888 | 0 |
| 0.8270833333333334 | 0 |
| 0.8277777777777778 | 0 |
| 0.8284722222222222 | 0 |
| 0.8291666666666666 | 0 |
| 0.8298611111111112 | 0 |
| 0.8305555555555556 | 0 |
| 0.8312499999999999 | 0 |
| 0.8319444444444444 | 0 |
| 0.8326388888888889 | 0 |
| 0.8333333333333334 | 0 |
| 0.8340277777777777 | 0 |
| 0.8347222222222223 | 0 |
| 0.8354166666666667 | 0 |
| 0.8361111111111111 | 0 |
| 0.8368055555555555 | 0 |
| 0.8375 | 0 |
| 0.8381944444444445 | 0 |
| 0.8388888888888889 | 0 |
| 0.8395833333333332 | 0 |
| 0.8402777777777778 | 0 |
| 0.8409722222222222 | 0 |
| 0.8416666666666667 | 0 |
| 0.842361111111111 | 0 |
| 0.8430555555555556 | 0 |
| 0.84375 | 0 |
| 0.8444444444444444 | 0 |
| 0.845138888888889 | 0 |
| 0.8458333333333333 | 0 |
| 0.8465277777777778 | 0 |
| 0.8472222222222222 | 0 |
| 0.8479166666666668 | 0 |
| 0.8486111111111111 | 0 |
| 0.8493055555555555 | 0 |
| 0.85 | 0 |
| 0.8506944444444445 | 0 |
| 0.8513888888888889 | 0 |
| 0.8520833333333333 | 0 |
| 0.8527777777777777 | 0 |
| 0.8534722222222223 | 0 |
| 0.8541666666666666 | 0 |
| 0.8548611111111111 | 0 |
| 0.8555555555555556 | 0 |
| 0.8562500000000001 | 0 |
| 0.8569444444444444 | 0 |
| 0.8576388888888888 | 0 |
| 0.8583333333333334 | 0 |
| 0.8590277777777778 | 0 |
| 0.8597222222222222 | 0 |
| 0.8604166666666666 | 0 |
| 0.8611111111111112 | 0 |
| 0.8618055555555556 | 0 |
| 0.8624999999999999 | 0 |
| 0.8631944444444444 | 0 |
| 0.8638888888888889 | 0 |
| 0.8645833333333334 | 0 |
| 0.8652777777777777 | 0 |
| 0.8659722222222223 | 0 |
| 0.8666666666666667 | 0 |
| 0.8673611111111111 | 0 |
| 0.8680555555555555 | 0 |
| 0.86875 | 0 |
| 0.8694444444444445 | 0 |
| 0.8701388888888889 | 0 |
| 0.8708333333333332 | 0 |
| 0.8715277777777778 | 0 |
| 0.8722222222222222 | 0 |
| 0.8729166666666667 | 0 |
| 0.873611111111111 | 0 |
| 0.8743055555555556 | 0 |
| 0.875 | 0 |
| 0.8756944444444444 | 0 |
| 0.876388888888889 | 0 |
| 0.8770833333333333 | 0 |
| 0.8777777777777778 | 0 |
| 0.8784722222222222 | 0 |
| 0.8791666666666668 | 0 |
| 0.8798611111111111 | 0 |
| 0.8805555555555555 | 0 |
| 0.88125 | 0 |
| 0.8819444444444445 | 0 |
| 0.8826388888888889 | 0 |
| 0.8833333333333333 | 0 |
| 0.8840277777777777 | 0 |
| 0.8847222222222223 | 0 |
| 0.8854166666666666 | 0 |
| 0.8861111111111111 | 0 |
| 0.8868055555555556 | 0 |
| 0.8875000000000001 | 0 |
| 0.8881944444444444 | 0 |
| 0.8888888888888888 | 0 |
| 0.8895833333333334 | 0 |
| 0.8902777777777778 | 0 |
| 0.8909722222222222 | 0 |
| 0.8916666666666666 | 0 |
| 0.8923611111111112 | 0 |
| 0.8930555555555556 | 0 |
| 0.8937499999999999 | 0 |
| 0.8944444444444444 | 0 |
| 0.8951388888888889 | 0 |
| 0.8958333333333334 | 0 |
| 0.8965277777777777 | 0 |
| 0.8972222222222223 | 0 |
| 0.8979166666666667 | 0 |
| 0.8986111111111111 | 0 |
| 0.8993055555555555 | 0 |
| 0.9 | 0 |
| 0.9006944444444445 | 0 |
| 0.9013888888888889 | 0 |
| 0.9020833333333332 | 0 |
| 0.9027777777777778 | 0 |
| 0.9034722222222222 | 0 |
| 0.9041666666666667 | 0 |
| 0.904861111111111 | 0 |
| 0.9055555555555556 | 0 |
| 0.90625 | 0 |
| 0.9069444444444444 | 0 |
| 0.907638888888889 | 0 |
| 0.9083333333333333 | 0 |
| 0.9090277777777778 | 0 |
| 0.9097222222222222 | 0 |
| 0.9104166666666668 | 0 |
| 0.9111111111111111 | 0 |
| 0.9118055555555555 | 0 |
| 0.9125 | 0 |
| 0.9131944444444445 | 0 |
| 0.9138888888888889 | 0 |
| 0.9145833333333333 | 0 |
| 0.9152777777777777 | 0 |
| 0.9159722222222223 | 0 |
| 0.9166666666666666 | 0 |
| 0.9173611111111111 | 0 |
| 0.9180555555555556 | 0 |
| 0.9187500000000001 | 0 |
| 0.9194444444444444 | 0 |
| 0.9201388888888888 | 0 |
| 0.9208333333333334 | 0 |
| 0.9215277777777778 | 0 |
| 0.9222222222222222 | 0 |
| 0.9229166666666666 | 0 |
| 0.9236111111111112 | 0 |
| 0.9243055555555556 | 0 |
| 0.9249999999999999 | 0 |
| 0.9256944444444444 | 0 |
| 0.9263888888888889 | 0 |
| 0.9270833333333334 | 0 |
| 0.9277777777777777 | 0 |
| 0.9284722222222223 | 0 |
| 0.9291666666666667 | 0 |
| 0.9298611111111111 | 0 |
| 0.9305555555555555 | 0 |
| 0.93125 | 0 |
| 0.9319444444444445 | 0 |
| 0.9326388888888889 | 0 |
| 0.9333333333333332 | 0 |
| 0.9340277777777778 | 0 |
| 0.9347222222222222 | 0 |
| 0.9354166666666667 | 0 |
| 0.936111111111111 | 0 |
| 0.9368055555555556 | 0 |
| 0.9375 | 0 |
| 0.9381944444444444 | 0 |
| 0.938888888888889 | 0 |
| 0.9395833333333333 | 0 |
| 0.9402777777777778 | 0 |
| 0.9409722222222222 | 0 |
| 0.9416666666666668 | 0 |
| 0.9423611111111111 | 0 |
| 0.9430555555555555 | 0 |
| 0.94375 | 0 |
| 0.9444444444444445 | 0 |
| 0.9451388888888889 | 0 |
| 0.9458333333333333 | 0 |
| 0.9465277777777777 | 0 |
| 0.9472222222222223 | 0 |
| 0.9479166666666666 | 0 |
| 0.9486111111111111 | 0 |
| 0.9493055555555556 | 0 |
| 0.9500000000000001 | 0 |
| 0.9506944444444444 | 0 |
| 0.9513888888888888 | 0 |
| 0.9520833333333334 | 0 |
| 0.9527777777777778 | 0 |
| 0.9534722222222222 | 0 |
| 0.9541666666666666 | 0 |
| 0.9548611111111112 | 0 |
| 0.9555555555555556 | 0 |
| 0.9562499999999999 | 0 |
| 0.9569444444444444 | 0 |
| 0.9576388888888889 | 0 |
| 0.9583333333333334 | 0 |
| 0.9590277777777777 | 0 |
| 0.9597222222222223 | 0 |
| 0.9604166666666667 | 0 |
| 0.9611111111111111 | 0 |
| 0.9618055555555555 | 0 |
| 0.9625 | 0 |
| 0.9631944444444445 | 0 |
| 0.9638888888888889 | 0 |
| 0.9645833333333332 | 0 |
| 0.9652777777777778 | 0 |
| 0.9659722222222222 | 0 |
| 0.9666666666666667 | 0 |
| 0.967361111111111 | 0 |
| 0.9680555555555556 | 0 |
| 0.96875 | 0 |
| 0.9694444444444444 | 0 |
| 0.970138888888889 | 0 |
| 0.9708333333333333 | 0 |
| 0.9715277777777778 | 0 |
| 0.9722222222222222 | 0 |
| 0.9729166666666668 | 0 |
| 0.9736111111111111 | 0 |
| 0.9743055555555555 | 0 |
| 0.975 | 0 |
| 0.9756944444444445 | 0 |
| 0.9763888888888889 | 0 |
| 0.9770833333333333 | 0 |
| 0.9777777777777777 | 0 |
| 0.9784722222222223 | 0 |
| 0.9791666666666666 | 0 |
| 0.9798611111111111 | 0 |
| 0.9805555555555556 | 0 |
| 0.9812500000000001 | 0 |
| 0.9819444444444444 | 0 |
| 0.9826388888888888 | 0 |
| 0.9833333333333334 | 0 |
| 0.9840277777777778 | 0 |
| 0.9847222222222222 | 0 |
| 0.9854166666666666 | 0 |
| 0.9861111111111112 | 0 |
| 0.9868055555555556 | 0 |
| 0.9874999999999999 | 0 |
| 0.9881944444444444 | 0 |
| 0.9888888888888889 | 0 |
| 0.9895833333333334 | 0 |
| 0.9902777777777777 | 0 |
| 0.9909722222222223 | 0 |
| 0.9916666666666667 | 0 |
| 0.9923611111111111 | 0 |
| 0.9930555555555555 | 0 |
| 0.99375 | 0 |
| 0.9944444444444445 | 0 |
| 0.9951388888888889 | 0 |
| 0.9958333333333332 | 0 |
| 0.9965277777777778 | 0 |
| 0.9972222222222222 | 0 |
| 0.9979166666666667 | 0 |
| 0.998611111111111 | 0 |
| 0.9993055555555556 | 0 |